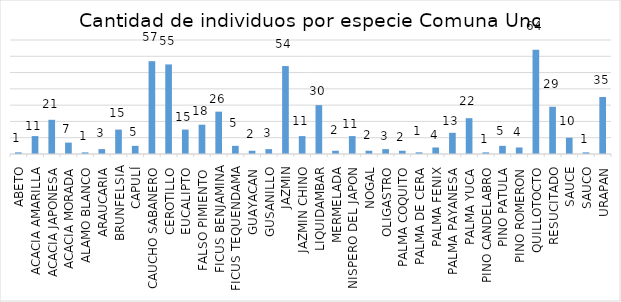
| Category | Series 0 |
|---|---|
| ABETO | 1 |
| ACACIA AMARILLA | 11 |
| ACACIA JAPONESA | 21 |
| ACACIA MORADA | 7 |
| ALAMO BLANCO | 1 |
| ARAUCARIA | 3 |
| BRUNFELSIA | 15 |
| CAPULÍ | 5 |
| CAUCHO SABANERO | 57 |
| CEROTILLO | 55 |
| EUCALIPTO | 15 |
| FALSO PIMIENTO  | 18 |
| FICUS BENJAMINA | 26 |
| FICUS TEQUENDAMA | 5 |
| GUAYACAN | 2 |
| GUSANILLO | 3 |
| JAZMIN | 54 |
| JAZMIN CHINO | 11 |
| LIQUIDAMBAR | 30 |
| MERMELADA | 2 |
| NISPERO DEL JAPON | 11 |
| NOGAL | 2 |
| OLIGASTRO | 3 |
| PALMA COQUITO | 2 |
| PALMA DE CERA | 1 |
| PALMA FENIX | 4 |
| PALMA PAYANESA | 13 |
| PALMA YUCA | 22 |
| PINO CANDELABRO | 1 |
| PINO PATULA | 5 |
| PINO ROMERON | 4 |
| QUILLOTOCTO | 64 |
| RESUCITADO | 29 |
| SAUCE | 10 |
| SAUCO | 1 |
| URAPAN | 35 |